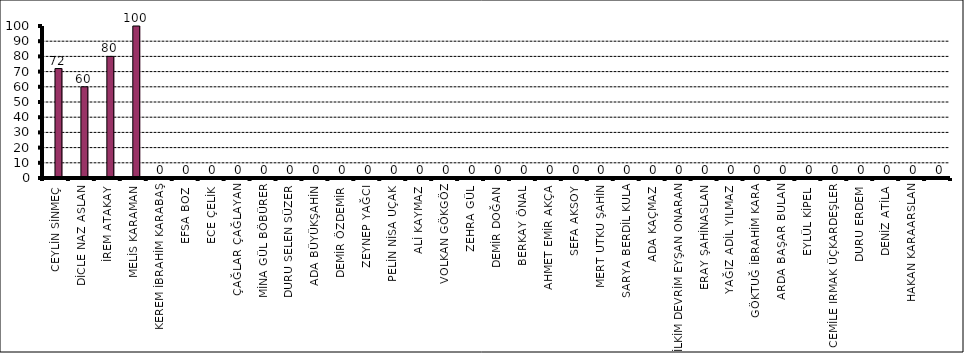
| Category | Series 0 | Series 1 |
|---|---|---|
| CEYLİN SİNMEÇ |  | 72 |
| DİCLE NAZ ASLAN |  | 60 |
| İREM ATAKAY |  | 80 |
| MELİS KARAMAN |  | 100 |
| KEREM İBRAHİM KARABAŞ |  | 0 |
| EFSA BOZ |  | 0 |
| ECE ÇELİK |  | 0 |
| ÇAĞLAR ÇAĞLAYAN |  | 0 |
| MİNA GÜL BÖBÜRER |  | 0 |
| DURU SELEN SÜZER |  | 0 |
| ADA BÜYÜKŞAHİN |  | 0 |
| DEMİR ÖZDEMİR |  | 0 |
| ZEYNEP YAĞCI |  | 0 |
| PELİN NİSA UÇAK |  | 0 |
| ALİ KAYMAZ |  | 0 |
| VOLKAN GÖKGÖZ |  | 0 |
| ZEHRA GÜL |  | 0 |
| DEMİR DOĞAN |  | 0 |
| BERKAY ÖNAL |  | 0 |
| AHMET EMİR AKÇA |  | 0 |
| SEFA AKSOY |  | 0 |
| MERT UTKU ŞAHİN |  | 0 |
| SARYA BERDİL KULA |  | 0 |
| ADA KAÇMAZ |  | 0 |
| İLKİM DEVRİM EYŞAN ONARAN |  | 0 |
| ERAY ŞAHİNASLAN |  | 0 |
| YAĞIZ ADİL YILMAZ |  | 0 |
| GÖKTUĞ İBRAHİM KARA |  | 0 |
| ARDA BAŞAR BULAN |  | 0 |
| EYLÜL KİPEL |  | 0 |
| CEMİLE IRMAK ÜÇKARDEŞLER |  | 0 |
| DURU ERDEM |  | 0 |
| DENİZ ATİLA |  | 0 |
| HAKAN KARAARSLAN |  | 0 |
|  |  | 0 |